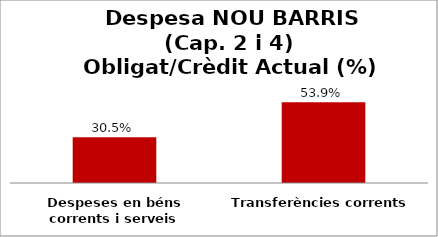
| Category | Series 0 |
|---|---|
| Despeses en béns corrents i serveis | 0.305 |
| Transferències corrents | 0.539 |